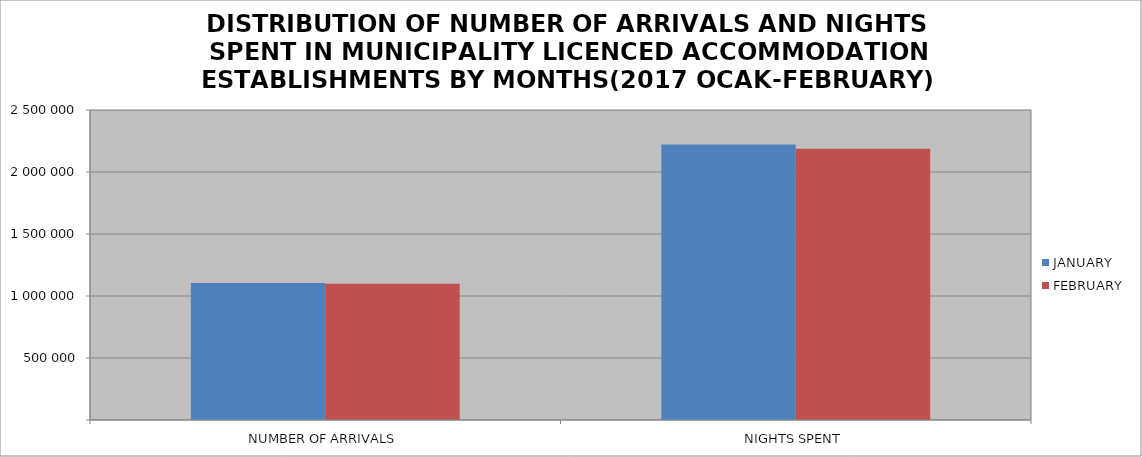
| Category | JANUARY | FEBRUARY |
|---|---|---|
| NUMBER OF ARRIVALS | 1104649 | 1099366 |
| NIGHTS SPENT | 2222261 | 2187982 |